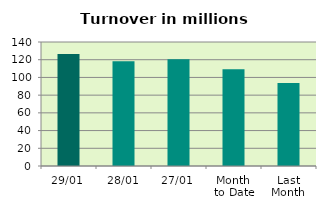
| Category | Series 0 |
|---|---|
| 29/01 | 126.345 |
| 28/01 | 118.34 |
| 27/01 | 120.412 |
| Month 
to Date | 109.163 |
| Last
Month | 93.592 |